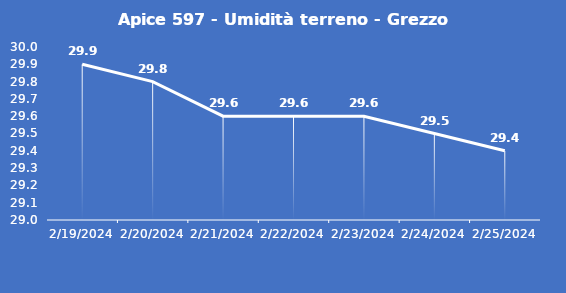
| Category | Apice 597 - Umidità terreno - Grezzo (%VWC) |
|---|---|
| 2/19/24 | 29.9 |
| 2/20/24 | 29.8 |
| 2/21/24 | 29.6 |
| 2/22/24 | 29.6 |
| 2/23/24 | 29.6 |
| 2/24/24 | 29.5 |
| 2/25/24 | 29.4 |